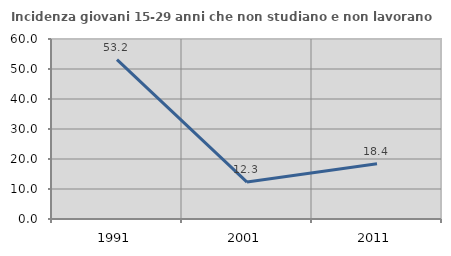
| Category | Incidenza giovani 15-29 anni che non studiano e non lavorano  |
|---|---|
| 1991.0 | 53.154 |
| 2001.0 | 12.315 |
| 2011.0 | 18.44 |